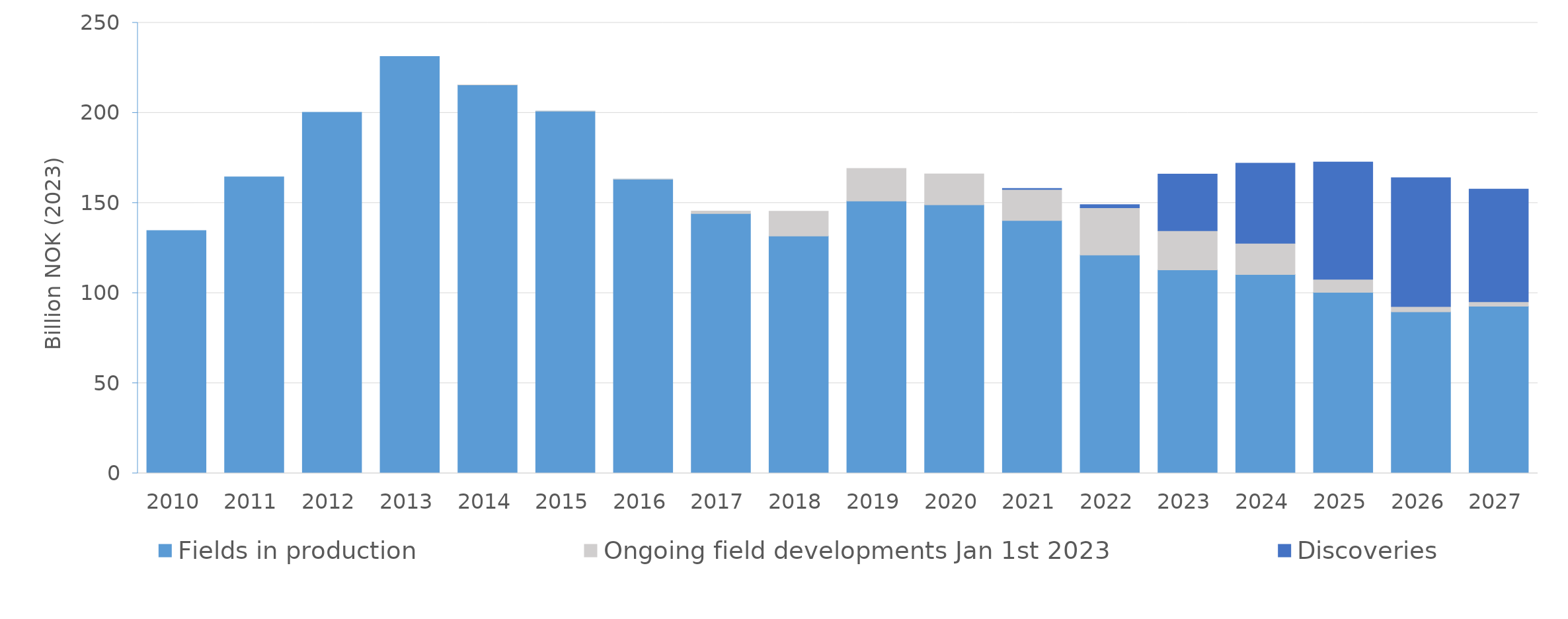
| Category | Fields in production | Ongoing field developments Jan 1st 2023 | Discoveries |
|---|---|---|---|
| 2010.0 | 134.689 | 0 | 0 |
| 2011.0 | 164.493 | 0 | 0 |
| 2012.0 | 200.357 | 0 | 0 |
| 2013.0 | 231.288 | 0 | 0 |
| 2014.0 | 215.519 | 0.001 | 0 |
| 2015.0 | 200.931 | 0.004 | 0 |
| 2016.0 | 163.244 | 0.006 | 0 |
| 2017.0 | 144.141 | 1.41 | 0 |
| 2018.0 | 131.713 | 13.757 | 0 |
| 2019.0 | 151.113 | 18.08 | 0 |
| 2020.0 | 149.028 | 17.148 | 0 |
| 2021.0 | 140.3 | 17.234 | 0.593 |
| 2022.0 | 121.164 | 26.176 | 1.751 |
| 2023.0 | 112.894 | 21.703 | 31.436 |
| 2024.0 | 110.326 | 17.331 | 44.436 |
| 2025.0 | 100.452 | 7.271 | 65.003 |
| 2026.0 | 89.596 | 2.955 | 71.444 |
| 2027.0 | 92.709 | 2.476 | 62.539 |